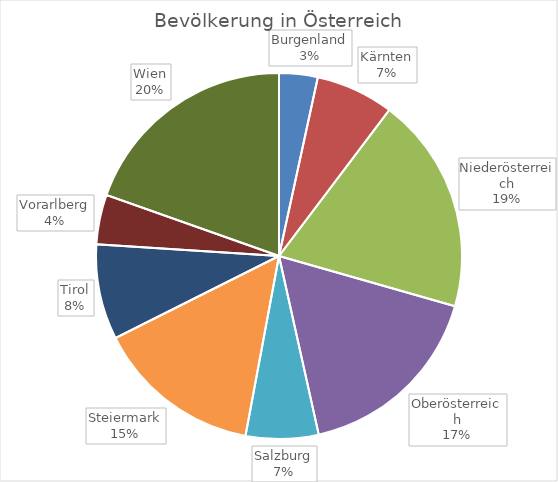
| Category | Bevölkerung |
|---|---|
| Burgenland | 276419 |
| Kärnten | 559440 |
| Niederösterreich | 1552848 |
| Oberösterreich | 1387086 |
| Salzburg | 521238 |
| Steiermark | 1190574 |
| Tirol | 683317 |
| Vorarlberg | 356590 |
| Wien | 1590242 |